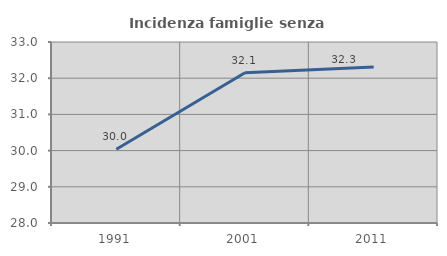
| Category | Incidenza famiglie senza nuclei |
|---|---|
| 1991.0 | 30.038 |
| 2001.0 | 32.15 |
| 2011.0 | 32.312 |